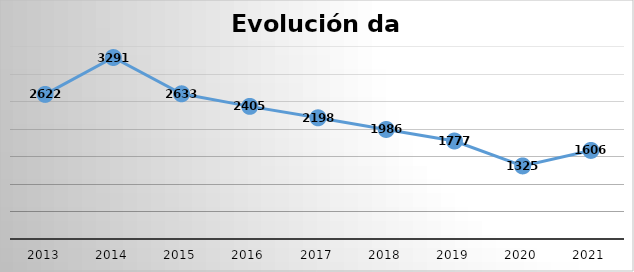
| Category | Series 0 |
|---|---|
| 2013.0 | 2622 |
| 2014.0 | 3291 |
| 2015.0 | 2633 |
| 2016.0 | 2405 |
| 2017.0 | 2198 |
| 2018.0 | 1986 |
| 2019.0 | 1777 |
| 2020.0 | 1325 |
| 2021.0 | 1606 |